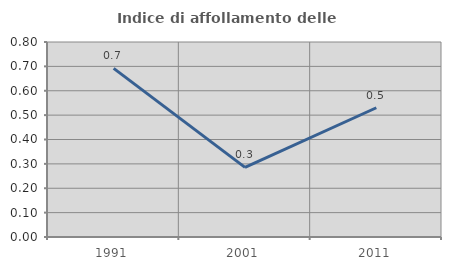
| Category | Indice di affollamento delle abitazioni  |
|---|---|
| 1991.0 | 0.692 |
| 2001.0 | 0.286 |
| 2011.0 | 0.53 |